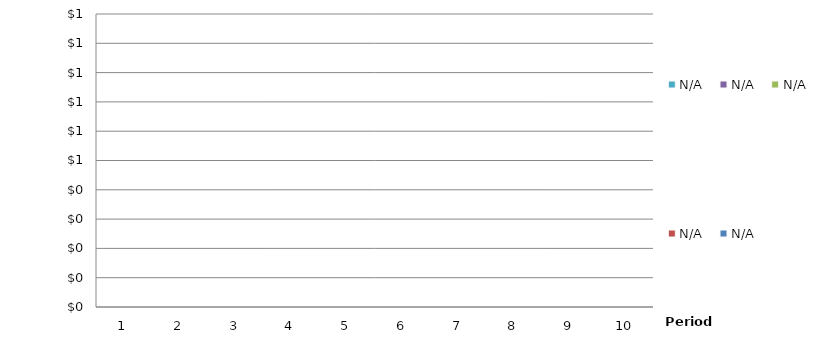
| Category | N/A | Series 5 | Series 6 | Series 7 | Series 8 | Series 9 | Series 10 | Series 11 | Series 12 | Series 13 | Series 14 | Series 15 | Series 16 | Series 17 | Series 18 | Series 19 |
|---|---|---|---|---|---|---|---|---|---|---|---|---|---|---|---|---|
| 0 | 0 |  |  |  |  |  |  |  |  |  |  |  |  |  |  |  |
| 1 | 0 |  |  |  |  |  |  |  |  |  |  |  |  |  |  |  |
| 2 | 0 |  |  |  |  |  |  |  |  |  |  |  |  |  |  |  |
| 3 | 0 |  |  |  |  |  |  |  |  |  |  |  |  |  |  |  |
| 4 | 0 |  |  |  |  |  |  |  |  |  |  |  |  |  |  |  |
| 5 | 0 |  |  |  |  |  |  |  |  |  |  |  |  |  |  |  |
| 6 | 0 |  |  |  |  |  |  |  |  |  |  |  |  |  |  |  |
| 7 | 0 |  |  |  |  |  |  |  |  |  |  |  |  |  |  |  |
| 8 | 0 |  |  |  |  |  |  |  |  |  |  |  |  |  |  |  |
| 9 | 0 |  |  |  |  |  |  |  |  |  |  |  |  |  |  |  |